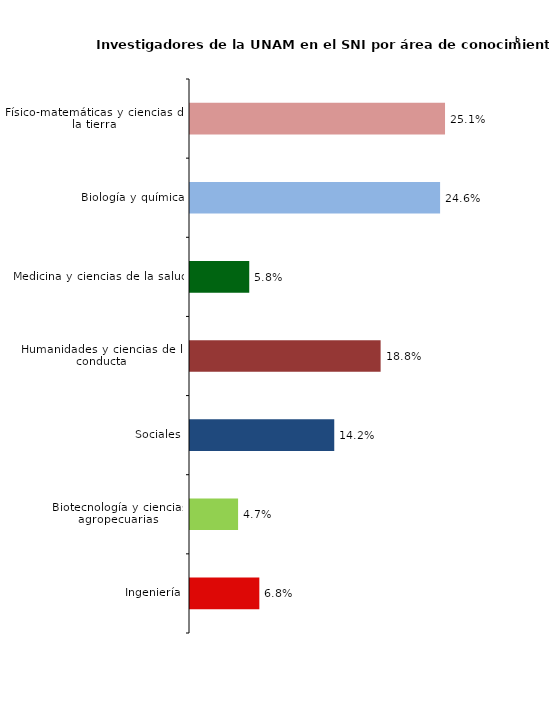
| Category | Series 0 |
|---|---|
| Ingeniería | 0.068 |
| Biotecnología y ciencias agropecuarias | 0.047 |
| Sociales | 0.142 |
| Humanidades y ciencias de la conducta | 0.188 |
| Medicina y ciencias de la salud | 0.058 |
| Biología y química | 0.246 |
| Físico-matemáticas y ciencias de la tierra | 0.251 |